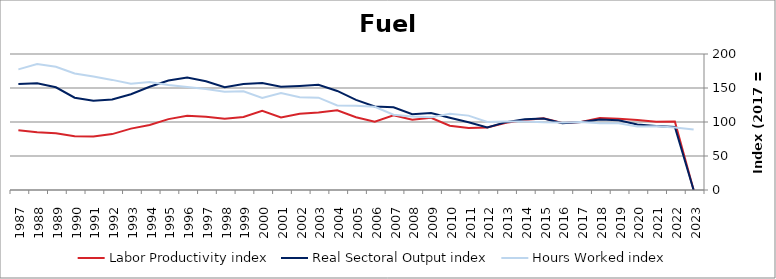
| Category | Labor Productivity index | Real Sectoral Output index | Hours Worked index |
|---|---|---|---|
| 2023.0 | 0 | 0 | 88.878 |
| 2022.0 | 100.855 | 92.766 | 91.98 |
| 2021.0 | 100.34 | 94.162 | 93.843 |
| 2020.0 | 103.112 | 96.433 | 93.523 |
| 2019.0 | 104.617 | 102.525 | 98.001 |
| 2018.0 | 105.724 | 103.78 | 98.162 |
| 2017.0 | 100 | 100 | 100 |
| 2016.0 | 98.599 | 98.043 | 99.436 |
| 2015.0 | 105.422 | 105.012 | 99.611 |
| 2014.0 | 103.054 | 103.896 | 100.817 |
| 2013.0 | 99.033 | 99.788 | 100.762 |
| 2012.0 | 91.911 | 91.946 | 100.038 |
| 2011.0 | 91.108 | 99.656 | 109.383 |
| 2010.0 | 94.61 | 106.208 | 112.258 |
| 2009.0 | 106.096 | 113.322 | 106.811 |
| 2008.0 | 103.284 | 111.548 | 108.002 |
| 2007.0 | 109.881 | 121.755 | 110.807 |
| 2006.0 | 100.443 | 122.889 | 122.348 |
| 2005.0 | 106.898 | 132.62 | 124.062 |
| 2004.0 | 117.276 | 145.696 | 124.233 |
| 2003.0 | 113.918 | 154.705 | 135.804 |
| 2002.0 | 112.166 | 153.091 | 136.486 |
| 2001.0 | 106.603 | 151.839 | 142.433 |
| 2000.0 | 116.409 | 157.427 | 135.236 |
| 1999.0 | 107.25 | 155.736 | 145.209 |
| 1998.0 | 104.721 | 151.24 | 144.422 |
| 1997.0 | 107.747 | 159.91 | 148.412 |
| 1996.0 | 109.224 | 165.443 | 151.471 |
| 1995.0 | 104.267 | 160.997 | 154.408 |
| 1994.0 | 95.624 | 151.779 | 158.725 |
| 1993.0 | 90.266 | 140.913 | 156.109 |
| 1992.0 | 82.202 | 133.104 | 161.923 |
| 1991.0 | 78.651 | 131.276 | 166.909 |
| 1990.0 | 79.193 | 135.743 | 171.407 |
| 1989.0 | 83.284 | 151.013 | 181.323 |
| 1988.0 | 84.758 | 156.885 | 185.098 |
| 1987.0 | 87.835 | 155.79 | 177.367 |